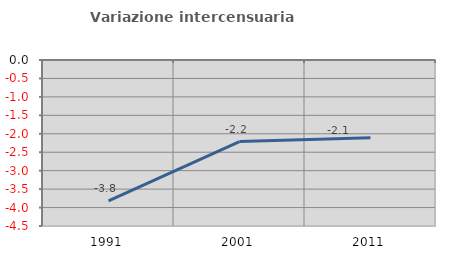
| Category | Variazione intercensuaria annua |
|---|---|
| 1991.0 | -3.817 |
| 2001.0 | -2.21 |
| 2011.0 | -2.104 |